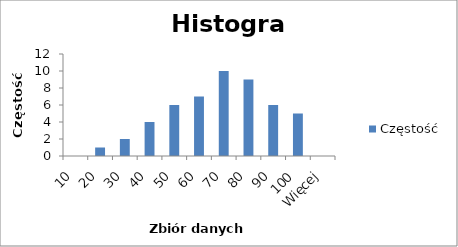
| Category | Częstość |
|---|---|
| 10 | 0 |
| 20 | 1 |
| 30 | 2 |
| 40 | 4 |
| 50 | 6 |
| 60 | 7 |
| 70 | 10 |
| 80 | 9 |
| 90 | 6 |
| 100 | 5 |
| Więcej | 0 |